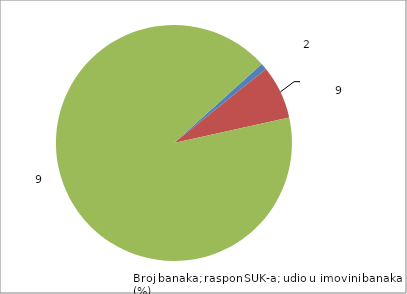
| Category | Udio u imovini |
|---|---|
| 8% < SUK < 15% | 0.009 |
| 15% < SUK < 20% | 0.073 |
| SUK > 20% | 0.918 |